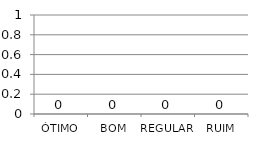
| Category | Series 0 | Series 1 | Series 2 |
|---|---|---|---|
| ÓTIMO |  | 0 |  |
| BOM |  | 0 |  |
| REGULAR |  | 0 |  |
| RUIM |  | 0 |  |